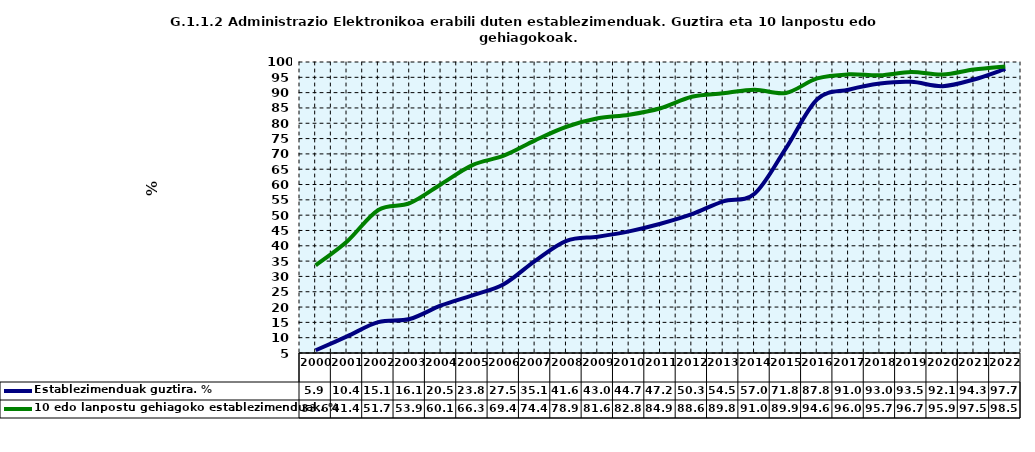
| Category | Establezimenduak guztira. % | 10 edo lanpostu gehiagoko establezimenduak. % |
|---|---|---|
| 2000.0 | 5.883 | 33.627 |
| 2001.0 | 10.421 | 41.411 |
| 2002.0 | 15.068 | 51.694 |
| 2003.0 | 16.098 | 53.904 |
| 2004.0 | 20.515 | 60.107 |
| 2005.0 | 23.837 | 66.349 |
| 2006.0 | 27.46 | 69.402 |
| 2007.0 | 35.078 | 74.42 |
| 2008.0 | 41.612 | 78.862 |
| 2009.0 | 42.972 | 81.627 |
| 2010.0 | 44.715 | 82.794 |
| 2011.0 | 47.2 | 84.9 |
| 2012.0 | 50.321 | 88.639 |
| 2013.0 | 54.524 | 89.774 |
| 2014.0 | 56.986 | 90.972 |
| 2015.0 | 71.8 | 89.9 |
| 2016.0 | 87.813 | 94.63 |
| 2017.0 | 90.959 | 95.964 |
| 2018.0 | 92.961 | 95.655 |
| 2019.0 | 93.517 | 96.71 |
| 2020.0 | 92.114 | 95.9 |
| 2021.0 | 94.294 | 97.529 |
| 2022.0 | 97.747 | 98.531 |